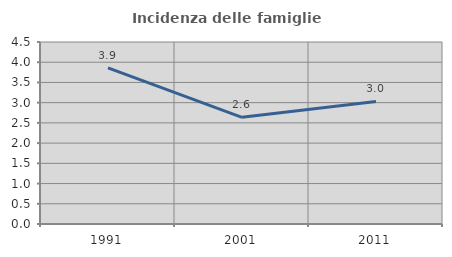
| Category | Incidenza delle famiglie numerose |
|---|---|
| 1991.0 | 3.861 |
| 2001.0 | 2.638 |
| 2011.0 | 3.03 |